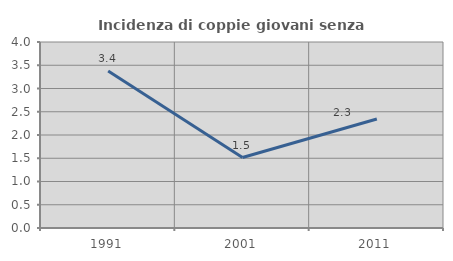
| Category | Incidenza di coppie giovani senza figli |
|---|---|
| 1991.0 | 3.378 |
| 2001.0 | 1.515 |
| 2011.0 | 2.344 |